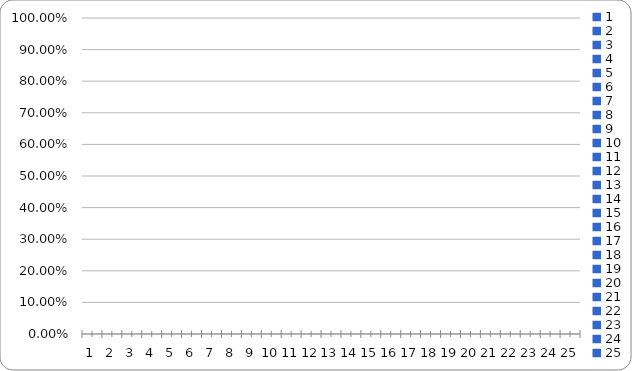
| Category | % |
|---|---|
| 0 | 0 |
| 1 | 0 |
| 2 | 0 |
| 3 | 0 |
| 4 | 0 |
| 5 | 0 |
| 6 | 0 |
| 7 | 0 |
| 8 | 0 |
| 9 | 0 |
| 10 | 0 |
| 11 | 0 |
| 12 | 0 |
| 13 | 0 |
| 14 | 0 |
| 15 | 0 |
| 16 | 0 |
| 17 | 0 |
| 18 | 0 |
| 19 | 0 |
| 20 | 0 |
| 21 | 0 |
| 22 | 0 |
| 23 | 0 |
| 24 | 0 |